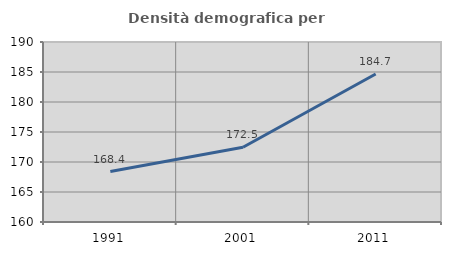
| Category | Densità demografica |
|---|---|
| 1991.0 | 168.411 |
| 2001.0 | 172.457 |
| 2011.0 | 184.666 |